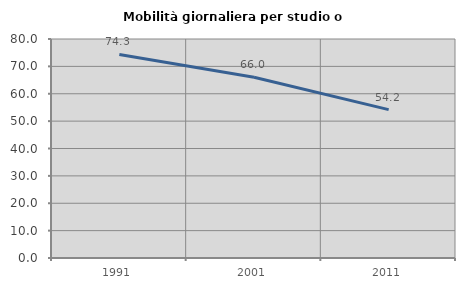
| Category | Mobilità giornaliera per studio o lavoro |
|---|---|
| 1991.0 | 74.342 |
| 2001.0 | 66.049 |
| 2011.0 | 54.198 |